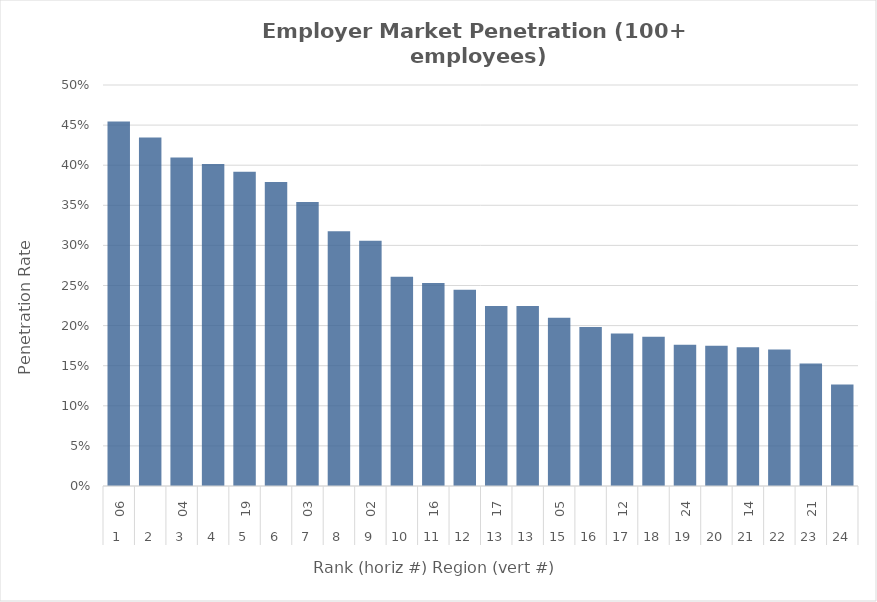
| Category | Rate |
|---|---|
| 0 | 0.455 |
| 1 | 0.435 |
| 2 | 0.41 |
| 3 | 0.402 |
| 4 | 0.392 |
| 5 | 0.379 |
| 6 | 0.354 |
| 7 | 0.318 |
| 8 | 0.306 |
| 9 | 0.261 |
| 10 | 0.253 |
| 11 | 0.245 |
| 12 | 0.224 |
| 13 | 0.224 |
| 14 | 0.21 |
| 15 | 0.198 |
| 16 | 0.19 |
| 17 | 0.186 |
| 18 | 0.176 |
| 19 | 0.175 |
| 20 | 0.173 |
| 21 | 0.17 |
| 22 | 0.153 |
| 23 | 0.126 |